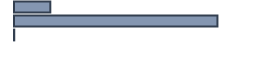
| Category | Percentatge |
|---|---|
| 0 | 15.132 |
| 1 | 84.767 |
| 2 | 0.102 |